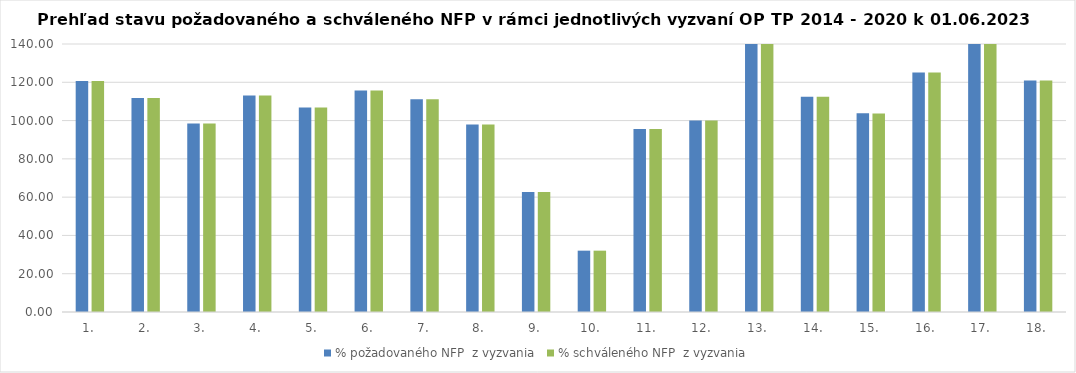
| Category | % požadovaného NFP  z vyzvania | % schváleného NFP  z vyzvania |
|---|---|---|
| 1. | 120.673 | 120.673 |
| 2. | 111.84 | 111.84 |
| 3. | 98.474 | 98.474 |
| 4. | 113.162 | 113.162 |
| 5. | 106.767 | 106.767 |
| 6. | 115.745 | 115.745 |
| 7. | 111.089 | 111.089 |
| 8. | 97.998 | 97.998 |
| 9. | 62.727 | 62.727 |
| 10. | 32.041 | 32.041 |
| 11. | 95.621 | 95.621 |
| 12. | 100.009 | 100.009 |
| 13. | 151.956 | 151.956 |
| 14. | 112.426 | 112.426 |
| 15. | 103.766 | 103.68 |
| 16. | 125.057 | 125.057 |
| 17. | 171.931 | 171.931 |
| 18. | 120.879 | 120.879 |